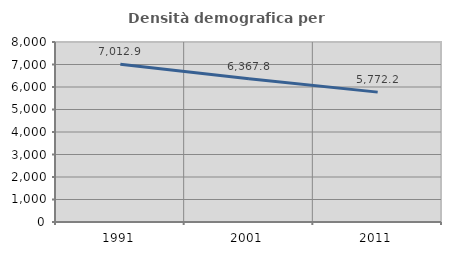
| Category | Densità demografica |
|---|---|
| 1991.0 | 7012.878 |
| 2001.0 | 6367.76 |
| 2011.0 | 5772.246 |